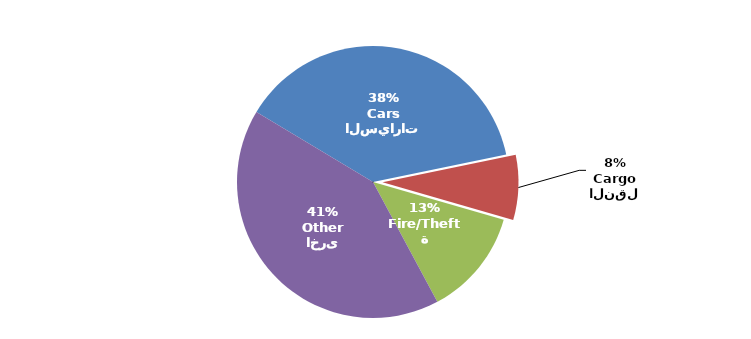
| Category | Series 0 |
|---|---|
| السيارات
Cars | 2616498 |
| النقل
Cargo | 529206 |
| الحريق/السرقة
Fire/Theft | 870924 |
| اخرى
Other | 2843942 |